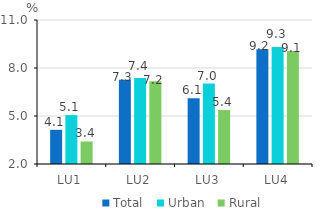
| Category | Total | Urban | Rural |
|---|---|---|---|
| LU1 | 4.138 | 5.054 | 3.407 |
| LU2 | 7.265 | 7.381 | 7.173 |
| LU3 | 6.107 | 7.028 | 5.372 |
| LU4 | 9.171 | 9.308 | 9.062 |